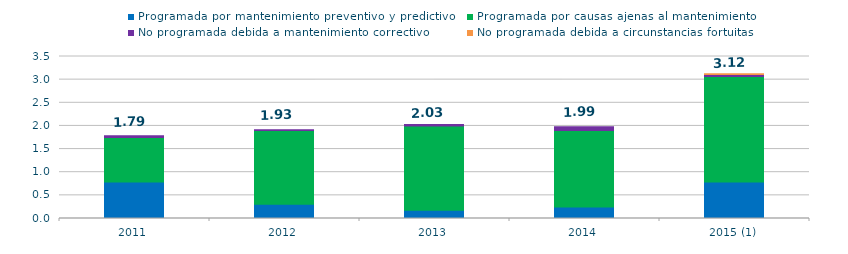
| Category | Programada por mantenimiento preventivo y predictivo | Programada por causas ajenas al mantenimiento  | No programada debida a mantenimiento correctivo  | No programada debida a circunstancias fortuitas  |
|---|---|---|---|---|
| 2011 | 0.79 | 0.96 | 0.04 | 0 |
| 2012 | 0.31 | 1.59 | 0.02 | 0 |
| 2013 | 0.18 | 1.82 | 0.03 | 0 |
| 2014 | 0.25 | 1.65 | 0.08 | 0 |
| 2015 (1) | 0.79 | 2.28 | 0.04 | 0.02 |